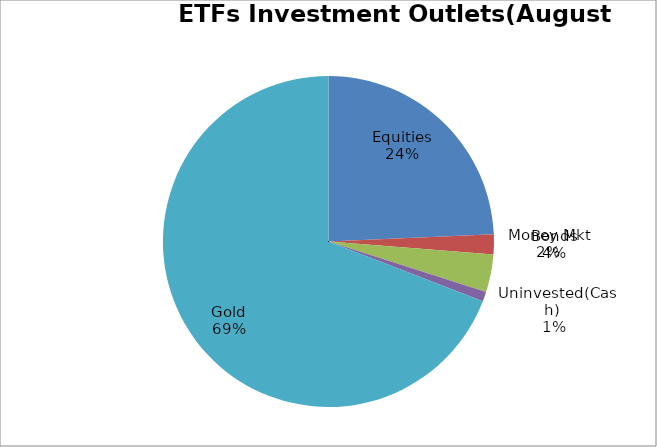
| Category | Series 0 |
|---|---|
| Equities | 3913723749.54 |
| Money Mkt | 316071867.88 |
| Bonds | 592621089.37 |
| Uninvested(Cash) | 152002086.71 |
| Gold | 11135395115.33 |